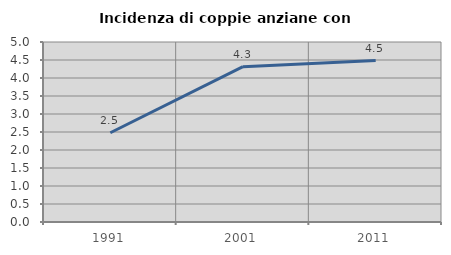
| Category | Incidenza di coppie anziane con figli |
|---|---|
| 1991.0 | 2.479 |
| 2001.0 | 4.316 |
| 2011.0 | 4.485 |